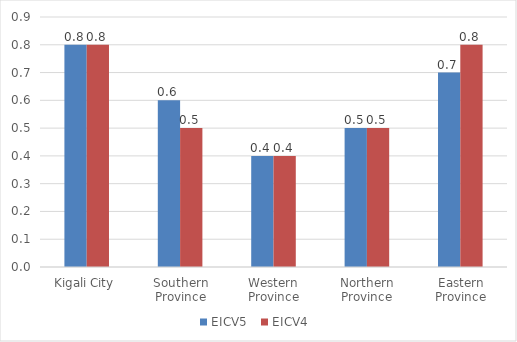
| Category | EICV5 | EICV4 |
|---|---|---|
| Kigali City | 0.8 | 0.8 |
| Southern Province | 0.6 | 0.5 |
| Western Province | 0.4 | 0.4 |
| Northern Province | 0.5 | 0.5 |
| Eastern Province | 0.7 | 0.8 |